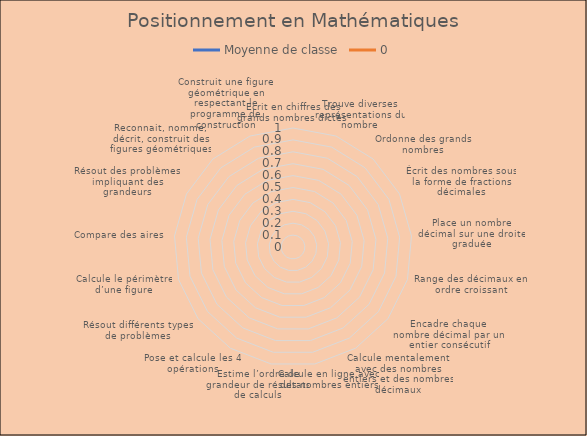
| Category | Moyenne de classe | 0 |
|---|---|---|
| Ecrit en chiffres des grands nombres dictés  | 0 |  |
| Trouve diverses représentations du nombre | 0 |  |
| Ordonne des grands nombres | 0 |  |
| Écrit des nombres sous la forme de fractions décimales | 0 |  |
| Place un nombre décimal sur une droite graduée | 0 |  |
| Range des décimaux en ordre croissant | 0 |  |
| Encadre chaque nombre décimal par un entier consécutif | 0 |  |
| Calcule mentalement avec des nombres entiers et des nombres décimaux | 0 |  |
| Calcule en ligne avec des nombres entiers | 0 |  |
| Estime l’ordre de grandeur de résultats de calculs | 0 |  |
| Pose et calcule les 4 opérations | 0 |  |
| Résout différents types de problèmes | 0 |  |
| Calcule le périmètre d’une figure | 0 |  |
| Compare des aires  | 0 |  |
| Résout des problèmes impliquant des grandeurs | 0 |  |
| Reconnait, nomme, décrit, construit des figures géométriques | 0 |  |
| Construit une figure géométrique en respectant le programme de construction | 0 |  |